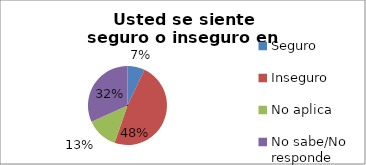
| Category | Series 0 |
|---|---|
| Seguro | 0.071 |
| Inseguro | 0.482 |
| No aplica | 0.129 |
| No sabe/No responde | 0.318 |